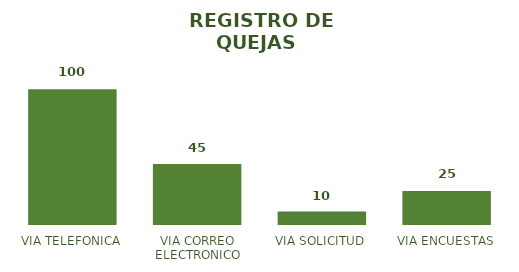
| Category | CANTIDAD |
|---|---|
| VIA TELEFONICA | 100 |
| VIA CORREO ELECTRONICO | 45 |
| VIA SOLICITUD | 10 |
| VIA ENCUESTAS | 25 |